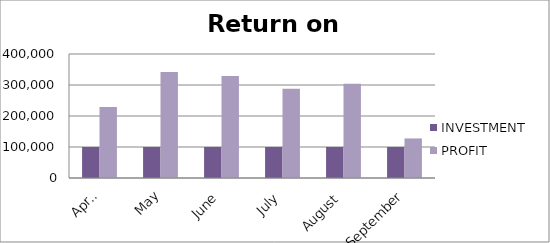
| Category | INVESTMENT  | PROFIT |
|---|---|---|
| April | 100000 | 228942 |
| May | 100000 | 341995 |
| June | 100000 | 328918 |
| July | 100000 | 288028 |
| August | 100000 | 303853 |
| September | 100000 | 127617 |